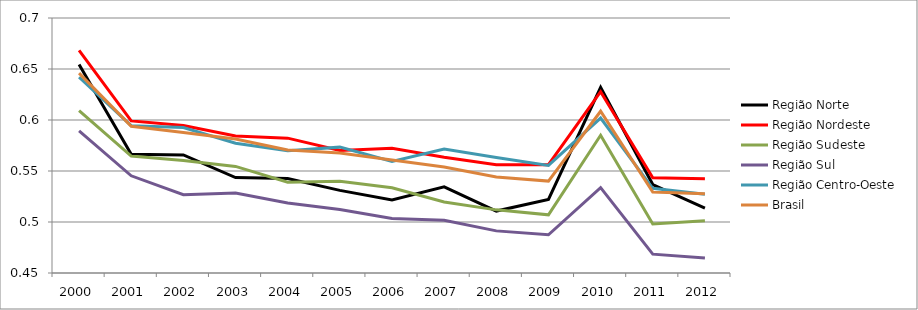
| Category | Região Norte | Região Nordeste | Região Sudeste | Região Sul | Região Centro-Oeste | Brasil |
|---|---|---|---|---|---|---|
| 2000.0 | 0.654 | 0.668 | 0.609 | 0.589 | 0.642 | 0.646 |
| 2001.0 | 0.566 | 0.599 | 0.565 | 0.545 | 0.594 | 0.594 |
| 2002.0 | 0.566 | 0.594 | 0.56 | 0.527 | 0.593 | 0.588 |
| 2003.0 | 0.544 | 0.584 | 0.554 | 0.528 | 0.577 | 0.581 |
| 2004.0 | 0.543 | 0.582 | 0.539 | 0.519 | 0.57 | 0.57 |
| 2005.0 | 0.531 | 0.57 | 0.54 | 0.512 | 0.573 | 0.568 |
| 2006.0 | 0.522 | 0.572 | 0.534 | 0.503 | 0.559 | 0.561 |
| 2007.0 | 0.534 | 0.564 | 0.52 | 0.502 | 0.572 | 0.554 |
| 2008.0 | 0.511 | 0.556 | 0.512 | 0.491 | 0.563 | 0.544 |
| 2009.0 | 0.522 | 0.556 | 0.507 | 0.488 | 0.556 | 0.54 |
| 2010.0 | 0.632 | 0.628 | 0.585 | 0.534 | 0.602 | 0.609 |
| 2011.0 | 0.537 | 0.543 | 0.498 | 0.468 | 0.533 | 0.529 |
| 2012.0 | 0.514 | 0.542 | 0.501 | 0.465 | 0.527 | 0.528 |